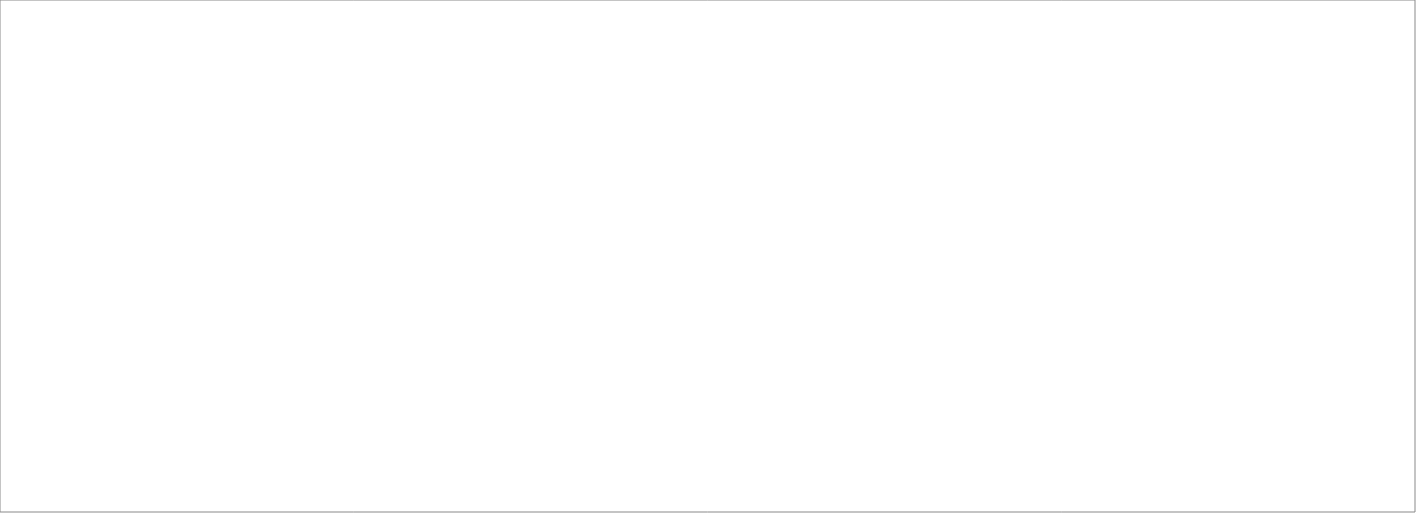
| Category | Total |
|---|---|
| Assessio Sverige AB | 100 |
| Randstad AB | 70 |
| Michael Catenacci AB | 70 |
| OnePartner Group AB | 70 |
| Pro Astri AB | 70 |